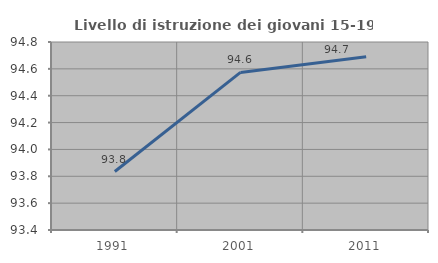
| Category | Livello di istruzione dei giovani 15-19 anni |
|---|---|
| 1991.0 | 93.836 |
| 2001.0 | 94.574 |
| 2011.0 | 94.69 |